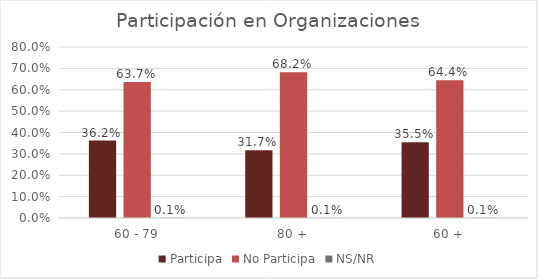
| Category | Participa | No Participa | NS/NR |
|---|---|---|---|
| 60 - 79 | 0.362 | 0.637 | 0.001 |
| 80 + | 0.317 | 0.682 | 0.001 |
| 60 + | 0.355 | 0.644 | 0.001 |